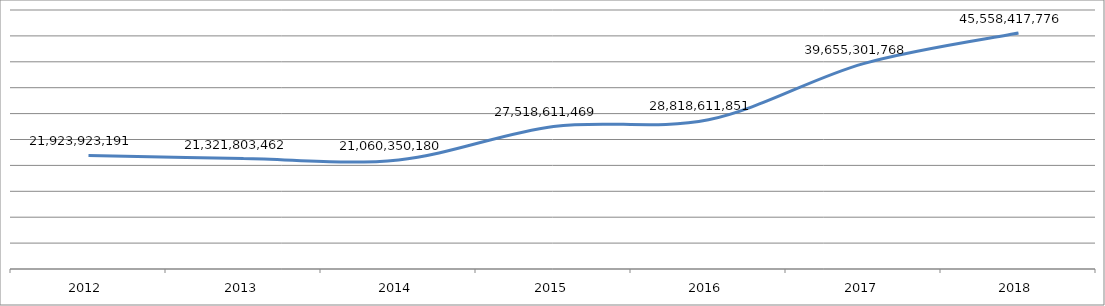
| Category | Series 0 |
|---|---|
| 2012.0 | 21923923191 |
| 2013.0 | 21321803462 |
| 2014.0 | 21060350180 |
| 2015.0 | 27518611469 |
| 2016.0 | 28818611851 |
| 2017.0 | 39655301768 |
| 2018.0 | 45558417776 |